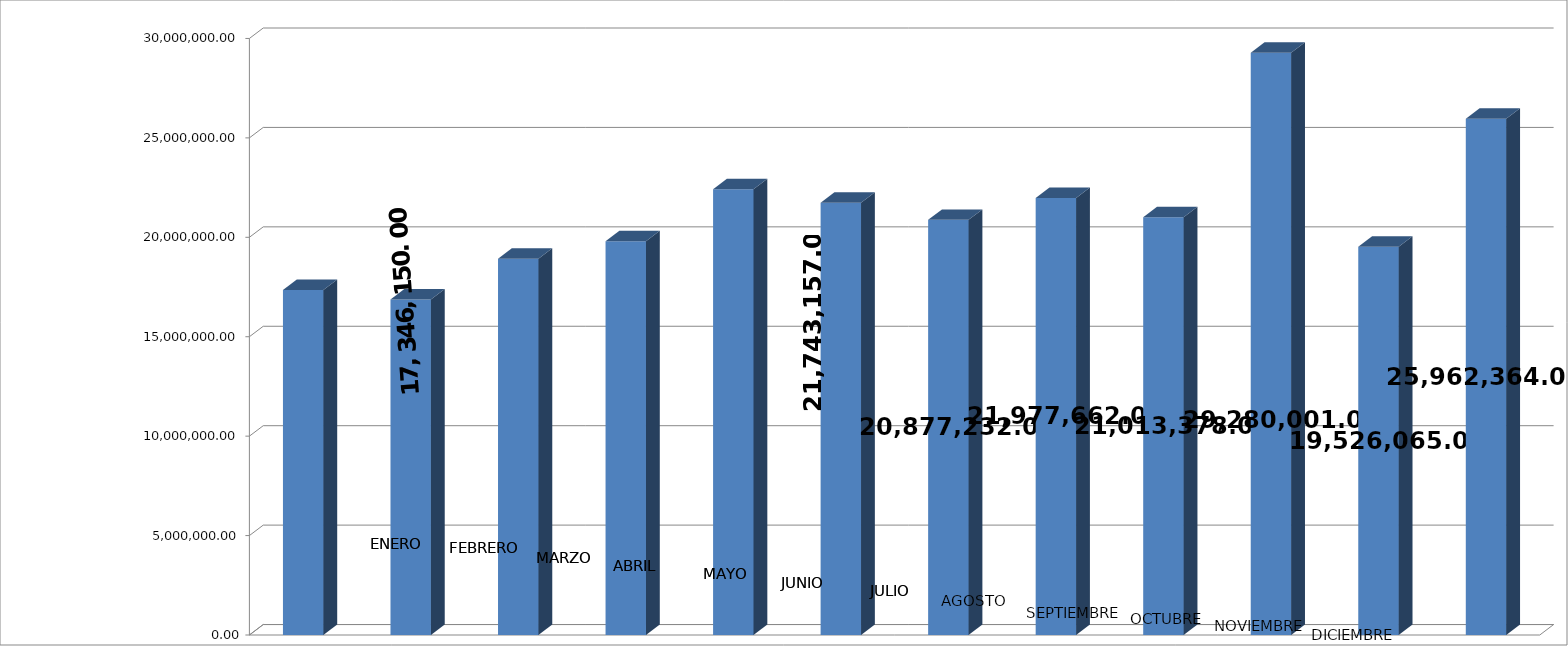
| Category | Series 0 |
|---|---|
| 0 | 17346150 |
| 1 | 16875976 |
| 2 | 18920092 |
| 3 | 19803924 |
| 4 | 22419638 |
| 5 | 21743157 |
| 6 | 20877232 |
| 7 | 21977662 |
| 8 | 21013378 |
| 9 | 29280001 |
| 10 | 19526065 |
| 11 | 25962364 |